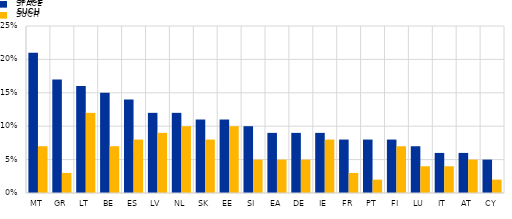
| Category | SPACE | SUCH |
|---|---|---|
| MT | 0.21 | 0.07 |
| GR | 0.17 | 0.03 |
| LT | 0.16 | 0.12 |
| BE | 0.15 | 0.07 |
| ES | 0.14 | 0.08 |
| LV | 0.12 | 0.09 |
| NL | 0.12 | 0.1 |
| SK | 0.11 | 0.08 |
| EE | 0.11 | 0.1 |
| SI | 0.1 | 0.05 |
| EA | 0.09 | 0.05 |
| DE | 0.09 | 0.05 |
| IE | 0.09 | 0.08 |
| FR | 0.08 | 0.03 |
| PT | 0.08 | 0.02 |
| FI | 0.08 | 0.07 |
| LU | 0.07 | 0.04 |
| IT | 0.06 | 0.04 |
| AT | 0.06 | 0.05 |
| CY | 0.05 | 0.02 |